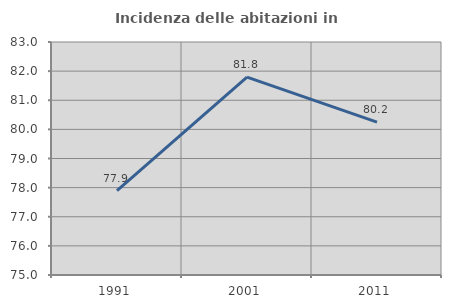
| Category | Incidenza delle abitazioni in proprietà  |
|---|---|
| 1991.0 | 77.895 |
| 2001.0 | 81.792 |
| 2011.0 | 80.248 |